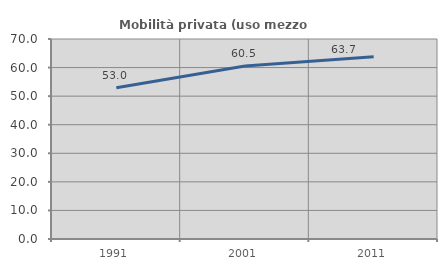
| Category | Mobilità privata (uso mezzo privato) |
|---|---|
| 1991.0 | 52.955 |
| 2001.0 | 60.529 |
| 2011.0 | 63.746 |